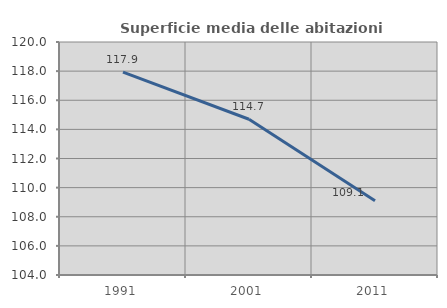
| Category | Superficie media delle abitazioni occupate |
|---|---|
| 1991.0 | 117.934 |
| 2001.0 | 114.695 |
| 2011.0 | 109.096 |